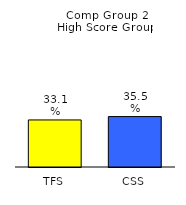
| Category | Series 0 |
|---|---|
| TFS | 0.331 |
| CSS | 0.355 |